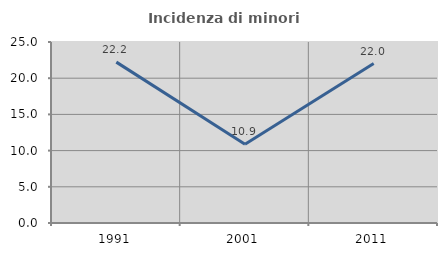
| Category | Incidenza di minori stranieri |
|---|---|
| 1991.0 | 22.222 |
| 2001.0 | 10.87 |
| 2011.0 | 22.018 |